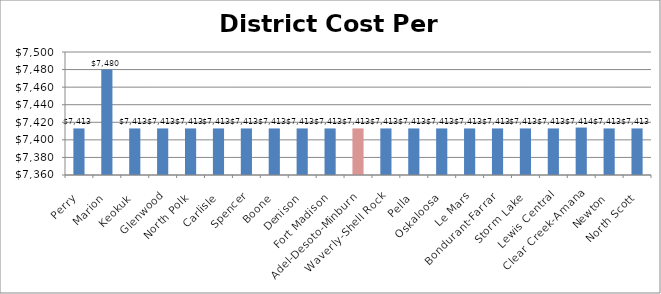
| Category | DCPP |
|---|---|
| Perry | 7413 |
| Marion | 7480 |
| Keokuk | 7413 |
| Glenwood | 7413 |
| North Polk | 7413 |
| Carlisle | 7413 |
| Spencer | 7413 |
| Boone | 7413 |
| Denison | 7413 |
| Fort Madison | 7413 |
| Adel-Desoto-Minburn | 7413 |
| Waverly-Shell Rock | 7413 |
| Pella | 7413 |
| Oskaloosa | 7413 |
| Le Mars | 7413 |
| Bondurant-Farrar | 7413 |
| Storm Lake | 7413 |
| Lewis Central | 7413 |
| Clear Creek-Amana | 7414 |
| Newton | 7413 |
| North Scott | 7413 |